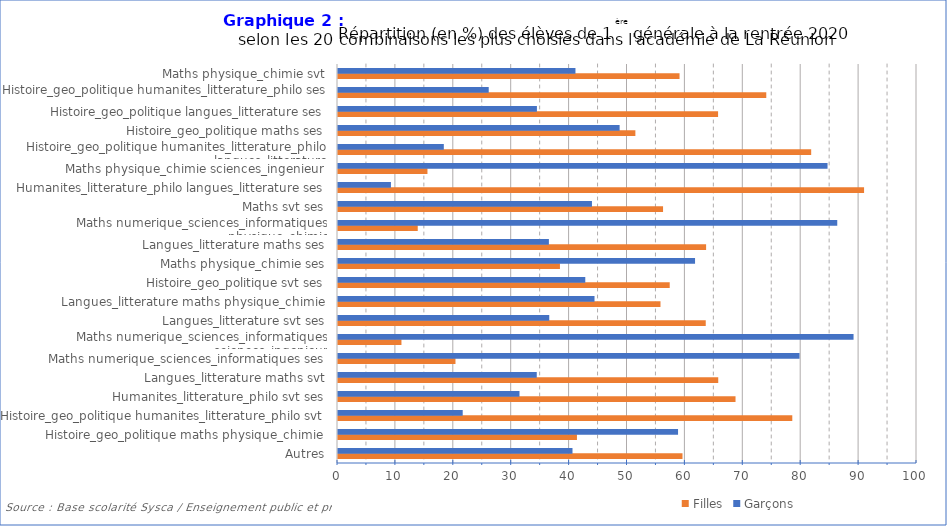
| Category | Filles | Garçons |
|---|---|---|
| Autres | 59.5 | 40.5 |
| Histoire_geo_politique maths physique_chimie | 41.27 | 58.73 |
| Histoire_geo_politique humanites_litterature_philo svt | 78.462 | 21.538 |
| Humanites_litterature_philo svt ses | 68.657 | 31.343 |
| Langues_litterature maths svt | 65.672 | 34.328 |
| Maths numerique_sciences_informatiques ses | 20.29 | 79.71 |
| Maths numerique_sciences_informatiques sciences_ingenieur | 10.959 | 89.041 |
| Langues_litterature svt ses | 63.514 | 36.486 |
| Langues_litterature maths physique_chimie | 55.696 | 44.304 |
| Histoire_geo_politique svt ses | 57.292 | 42.708 |
| Maths physique_chimie ses | 38.333 | 61.667 |
| Langues_litterature maths ses | 63.576 | 36.424 |
| Maths numerique_sciences_informatiques physique_chimie | 13.772 | 86.228 |
| Maths svt ses | 56.14 | 43.86 |
| Humanites_litterature_philo langues_litterature ses | 90.857 | 9.143 |
| Maths physique_chimie sciences_ingenieur | 15.451 | 84.549 |
| Histoire_geo_politique humanites_litterature_philo langues_litterature | 81.724 | 18.276 |
| Histoire_geo_politique maths ses | 51.361 | 48.639 |
| Histoire_geo_politique langues_litterature ses | 65.644 | 34.356 |
| Histoire_geo_politique humanites_litterature_philo ses | 73.969 | 26.031 |
| Maths physique_chimie svt | 58.988 | 41.012 |